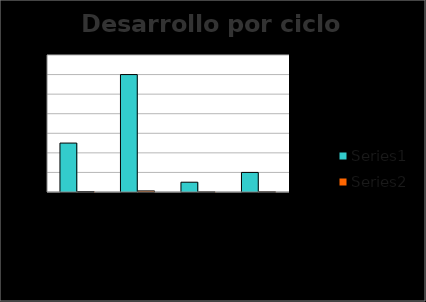
| Category | Series 0 | Series 1 |
|---|---|---|
| I. PLANEAR | 25 | 0.25 |
| II. HACER | 60 | 0.55 |
| III. VERIFICAR | 5 | 0.05 |
| IV. ACTUAR | 10 | 0.095 |